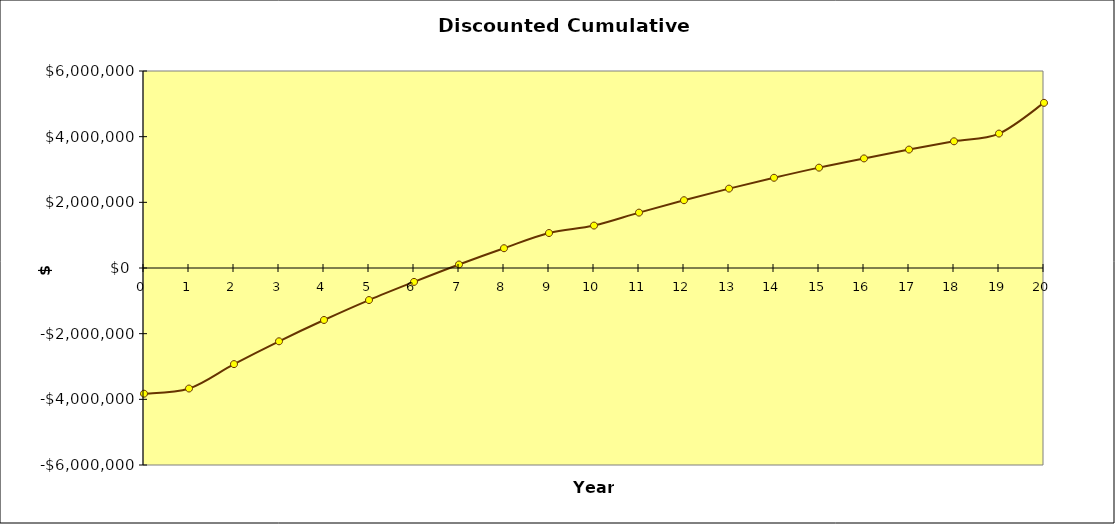
| Category | Series 0 |
|---|---|
| 0.0 | -3828212.219 |
| 1.0 | -3670754.904 |
| 2.0 | -2927287.388 |
| 3.0 | -2232457.934 |
| 4.0 | -1583084.613 |
| 5.0 | -976193.658 |
| 6.0 | -423197.34 |
| 7.0 | 106884.724 |
| 8.0 | 602288.521 |
| 9.0 | 1065282.725 |
| 10.0 | 1292436.552 |
| 11.0 | 1686715.284 |
| 12.0 | 2064656.469 |
| 13.0 | 2417872.53 |
| 14.0 | 2747980.998 |
| 15.0 | 3056493.586 |
| 16.0 | 3337608.872 |
| 17.0 | 3607075.714 |
| 18.0 | 3858913.884 |
| 19.0 | 4094276.66 |
| 20.0 | 5030389.667 |